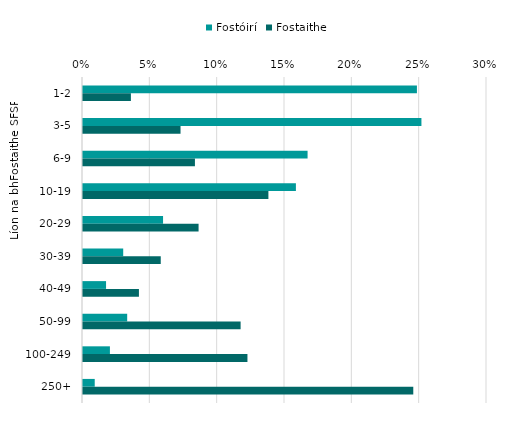
| Category | Fostóirí | Fostaithe |
|---|---|---|
| 1-2 | 0.248 | 0.036 |
| 3-5 | 0.251 | 0.072 |
| 6-9 | 0.167 | 0.083 |
| 10-19 | 0.158 | 0.138 |
| 20-29 | 0.059 | 0.086 |
| 30-39 | 0.03 | 0.058 |
| 40-49 | 0.017 | 0.042 |
| 50-99 | 0.033 | 0.117 |
| 100-249 | 0.02 | 0.122 |
| 250+ | 0.009 | 0.245 |